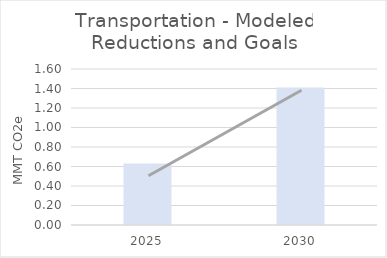
| Category | Transportation |
|---|---|
| 2025.0 | 0.631 |
| 2030.0 | 1.409 |